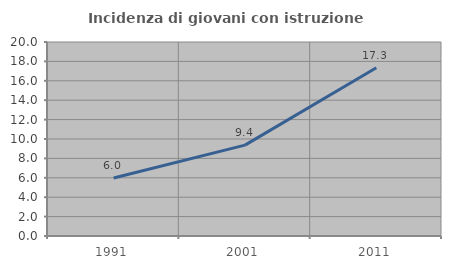
| Category | Incidenza di giovani con istruzione universitaria |
|---|---|
| 1991.0 | 5.971 |
| 2001.0 | 9.37 |
| 2011.0 | 17.343 |